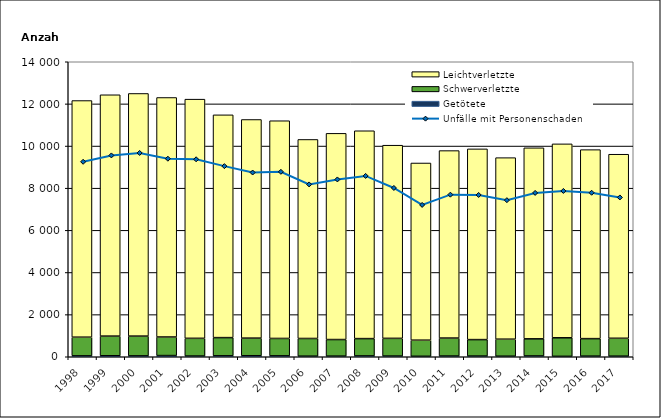
| Category | Getötete | Schwerverletzte | Leichtverletzte |
|---|---|---|---|
| 1998.0 | 42 | 887 | 11230 |
| 1999.0 | 47 | 933 | 11453 |
| 2000.0 | 41 | 939 | 11515 |
| 2001.0 | 56 | 882 | 11366 |
| 2002.0 | 34 | 841 | 11350 |
| 2003.0 | 44 | 864 | 10573 |
| 2004.0 | 48 | 836 | 10376 |
| 2005.0 | 43 | 826 | 10332 |
| 2006.0 | 28 | 839 | 9446 |
| 2007.0 | 30 | 787 | 9786 |
| 2008.0 | 40 | 821 | 9864 |
| 2009.0 | 33 | 840 | 9167 |
| 2010.0 | 22 | 765 | 8408 |
| 2011.0 | 34 | 853 | 8897 |
| 2012.0 | 33 | 781 | 9051 |
| 2013.0 | 26 | 808 | 8615 |
| 2014.0 | 38 | 812 | 9066 |
| 2015.0 | 20 | 880 | 9203 |
| 2016.0 | 29 | 831 | 8969 |
| 2017.0 | 28 | 849 | 8734 |